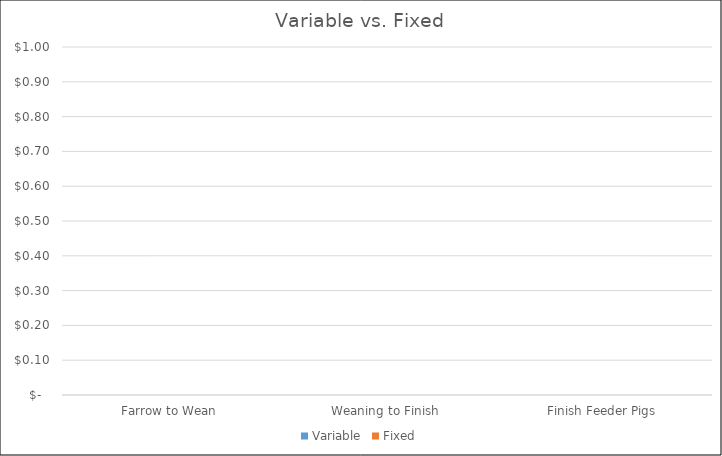
| Category | Variable | Fixed |
|---|---|---|
| 0 | 0 | 0 |
| 1 | 0 | 0 |
| 2 | 0 | 0 |